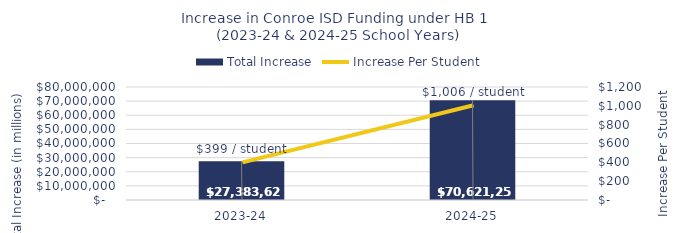
| Category | Total Increase |
|---|---|
| 2023-24 | 27383621 |
| 2024-25 | 70621250 |